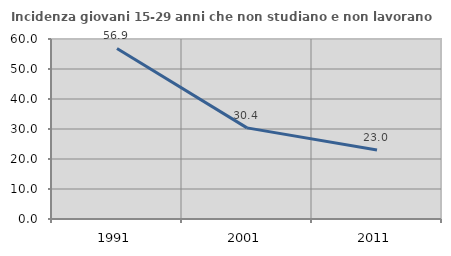
| Category | Incidenza giovani 15-29 anni che non studiano e non lavorano  |
|---|---|
| 1991.0 | 56.86 |
| 2001.0 | 30.37 |
| 2011.0 | 23 |